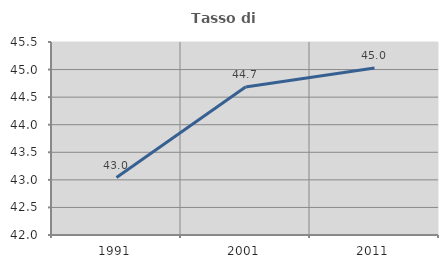
| Category | Tasso di occupazione   |
|---|---|
| 1991.0 | 43.041 |
| 2001.0 | 44.685 |
| 2011.0 | 45.029 |